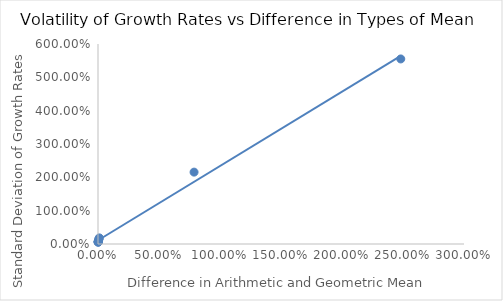
| Category | Std Dev |
|---|---|
| 0.001209116148541356 | 0.057 |
| 0.006814895041925895 | 0.136 |
| 0.006540943363647467 | 0.146 |
| 2.4818297336425754 | 5.552 |
| 0.7874582505630909 | 2.156 |
| 0.0013052986605836814 | 0.06 |
| 0.0028554047472421906 | 0.085 |
| 0.010687448464182542 | 0.183 |
| 0.001863972462189084 | 0.07 |
| 0.0013262664686390646 | 0.061 |
| 0.0015830536050302768 | 0.067 |